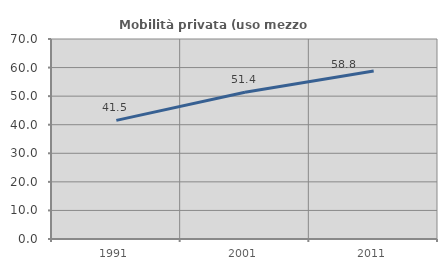
| Category | Mobilità privata (uso mezzo privato) |
|---|---|
| 1991.0 | 41.527 |
| 2001.0 | 51.376 |
| 2011.0 | 58.765 |